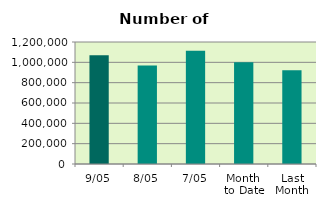
| Category | Series 0 |
|---|---|
| 9/05 | 1069280 |
| 8/05 | 968864 |
| 7/05 | 1112922 |
| Month 
to Date | 1001193.667 |
| Last
Month | 921109.3 |